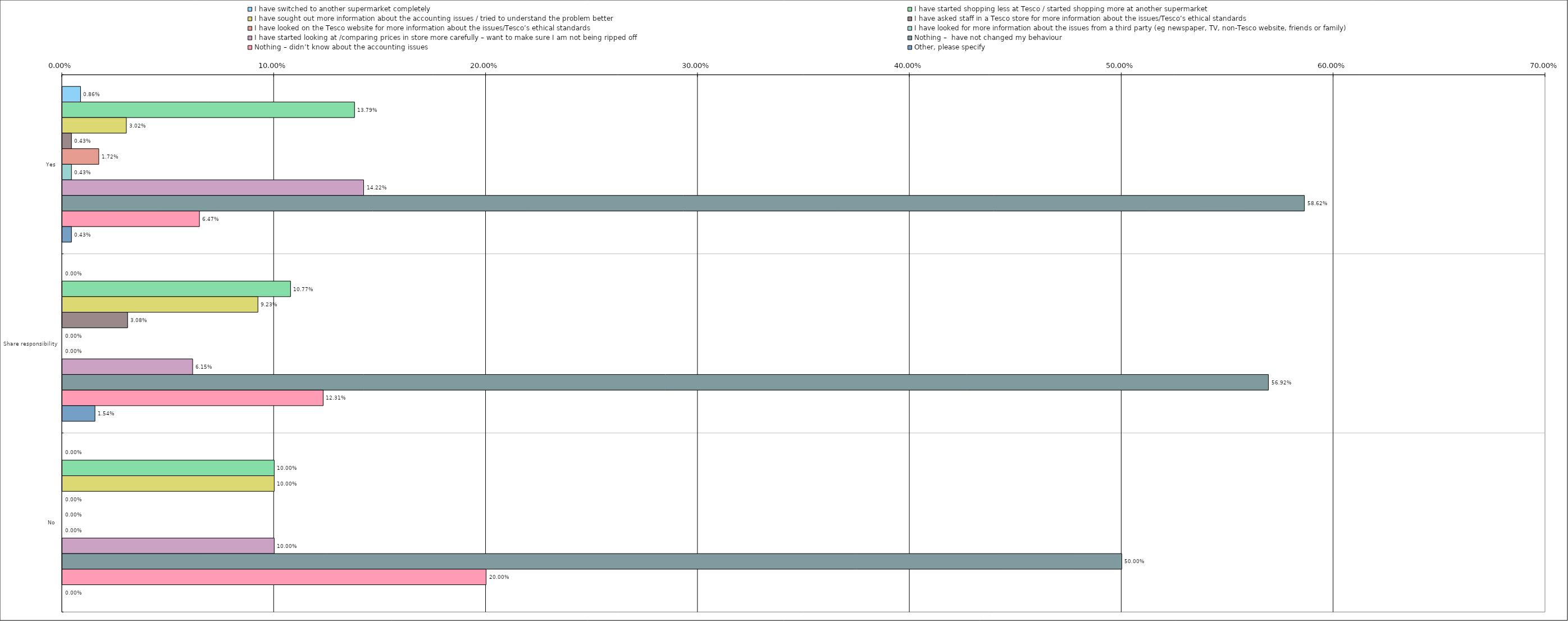
| Category | I have switched to another supermarket completely | I have started shopping less at Tesco / started shopping more at another supermarket | I have sought out more information about the accounting issues / tried to understand the problem better | I have asked staff in a Tesco store for more information about the issues/Tesco’s ethical standards | I have looked on the Tesco website for more information about the issues/Tesco’s ethical standards | I have looked for more information about the issues from a third party (eg newspaper, TV, non-Tesco website, friends or family) | I have started looking at /comparing prices in store more carefully – want to make sure I am not being ripped off | Nothing –  have not changed my behaviour | Nothing – didn’t know about the accounting issues | Other, please specify |
|---|---|---|---|---|---|---|---|---|---|---|
| 0 | 0.009 | 0.138 | 0.03 | 0.004 | 0.017 | 0.004 | 0.142 | 0.586 | 0.065 | 0.004 |
| 1 | 0 | 0.108 | 0.092 | 0.031 | 0 | 0 | 0.062 | 0.569 | 0.123 | 0.015 |
| 2 | 0 | 0.1 | 0.1 | 0 | 0 | 0 | 0.1 | 0.5 | 0.2 | 0 |